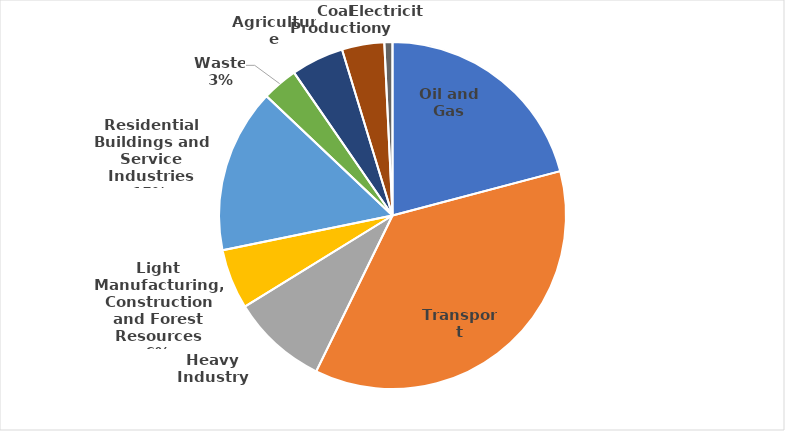
| Category | Series 0 |
|---|---|
| Oil and Gas | 12.411 |
| Transport | 21.613 |
| Heavy Industry | 5.321 |
| Light Manufacturing, Construction and Forest Resources | 3.322 |
| Residential Buildings and Service Industries | 9.082 |
| Waste | 1.978 |
| Agriculture | 2.914 |
| Coal Production | 2.345 |
| Electricity | 0.449 |